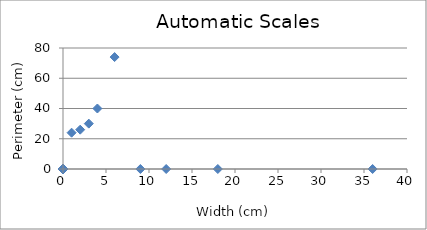
| Category | Perimeter |
|---|---|
| 6.0 | 24 |
| 9.0 | 26 |
| 12.0 | 30 |
| 18.0 | 40 |
| 36.0 | 74 |
| 0.0 | 0 |
| 0.0 | 0 |
| 0.0 | 0 |
| 0.0 | 0 |
| 0.0 | 0 |
| 0.0 | 0 |
| 0.0 | 0 |
| 0.0 | 0 |
| 0.0 | 0 |
| 0.0 | 0 |
| 0.0 | 0 |